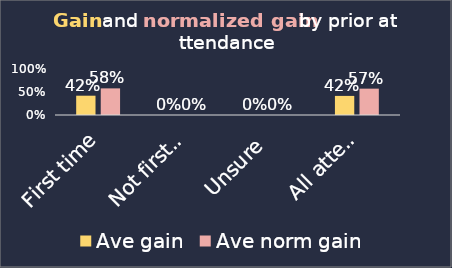
| Category | Ave gain | Ave norm gain |
|---|---|---|
| First time | 0.419 | 0.579 |
| Not first time | 0 | 0 |
| Unsure | 0 | 0 |
| All attendees | 0.415 | 0.573 |